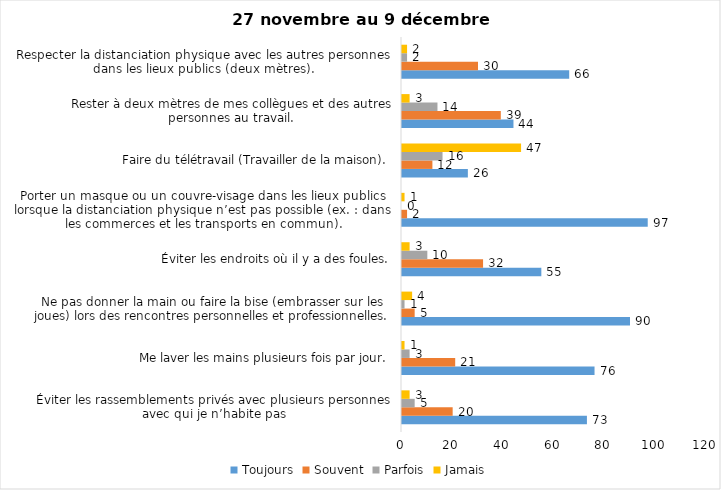
| Category | Toujours | Souvent | Parfois | Jamais |
|---|---|---|---|---|
| Éviter les rassemblements privés avec plusieurs personnes avec qui je n’habite pas | 73 | 20 | 5 | 3 |
| Me laver les mains plusieurs fois par jour. | 76 | 21 | 3 | 1 |
| Ne pas donner la main ou faire la bise (embrasser sur les joues) lors des rencontres personnelles et professionnelles. | 90 | 5 | 1 | 4 |
| Éviter les endroits où il y a des foules. | 55 | 32 | 10 | 3 |
| Porter un masque ou un couvre-visage dans les lieux publics lorsque la distanciation physique n’est pas possible (ex. : dans les commerces et les transports en commun). | 97 | 2 | 0 | 1 |
| Faire du télétravail (Travailler de la maison). | 26 | 12 | 16 | 47 |
| Rester à deux mètres de mes collègues et des autres personnes au travail. | 44 | 39 | 14 | 3 |
| Respecter la distanciation physique avec les autres personnes dans les lieux publics (deux mètres). | 66 | 30 | 2 | 2 |